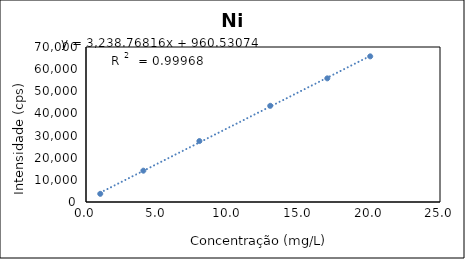
| Category | Series 0 |
|---|---|
| 1.0064191900450576 | 3693.338 |
| 4.051023499965846 | 14143.738 |
| 8.00828734155965 | 27525.438 |
| 13.011698239379127 | 43440.838 |
| 17.040428357153395 | 55844.038 |
| 20.072138708863452 | 65773.538 |